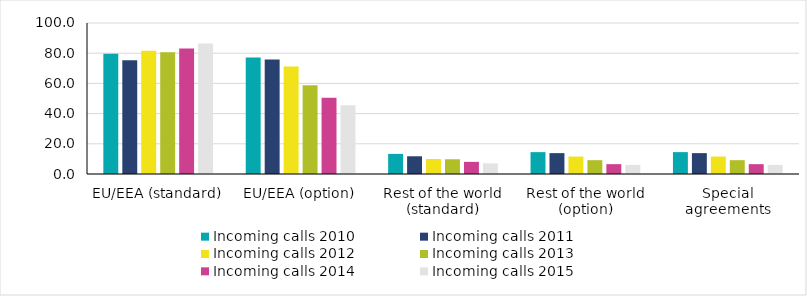
| Category | Incoming calls 2010 | Incoming calls 2011 | Incoming calls 2012 | Incoming calls 2013 | Incoming calls 2014 | Incoming calls 2015 |
|---|---|---|---|---|---|---|
| EU/EEA (standard) | 79.691 | 75.401 | 81.659 | 80.601 | 83.089 | 86.415 |
| EU/EEA (option) | 77.154 | 75.797 | 71.147 | 58.747 | 50.538 | 45.556 |
| Rest of the world (standard) | 13.319 | 11.742 | 9.923 | 9.754 | 8.04 | 7.04 |
| Rest of the world (option) | 14.485 | 13.826 | 11.545 | 9.162 | 6.512 | 6.011 |
| Special agreements | 14.485 | 13.826 | 11.545 | 9.162 | 6.512 | 6.011 |